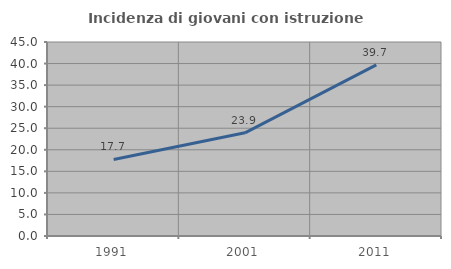
| Category | Incidenza di giovani con istruzione universitaria |
|---|---|
| 1991.0 | 17.75 |
| 2001.0 | 23.936 |
| 2011.0 | 39.692 |